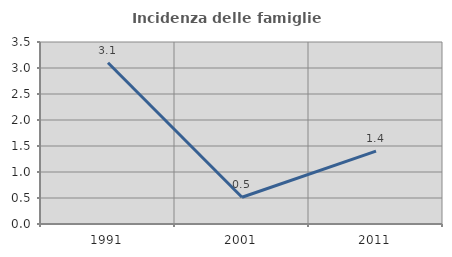
| Category | Incidenza delle famiglie numerose |
|---|---|
| 1991.0 | 3.101 |
| 2001.0 | 0.514 |
| 2011.0 | 1.403 |